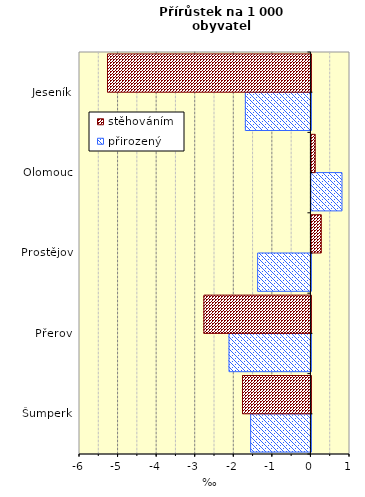
| Category | přirozený | stěhováním |
|---|---|---|
| Šumperk | -1.563 | -1.774 |
| Přerov | -2.124 | -2.775 |
| Prostějov | -1.381 | 0.256 |
| Olomouc | 0.792 | 0.099 |
| Jeseník | -1.7 | -5.274 |